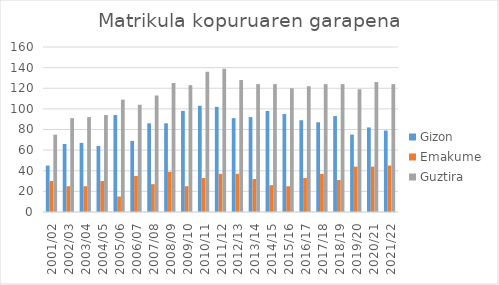
| Category | Gizon | Emakume | Guztira |
|---|---|---|---|
| 2001/02 | 45 | 30 | 75 |
| 2002/03 | 66 | 25 | 91 |
| 2003/04 | 67 | 25 | 92 |
| 2004/05 | 64 | 30 | 94 |
| 2005/06 | 94 | 15 | 109 |
| 2006/07 | 69 | 35 | 104 |
| 2007/08 | 86 | 27 | 113 |
| 2008/09 | 86 | 39 | 125 |
| 2009/10 | 98 | 25 | 123 |
| 2010/11 | 103 | 33 | 136 |
| 2011/12 | 102 | 37 | 139 |
| 2012/13 | 91 | 37 | 128 |
| 2013/14 | 92 | 32 | 124 |
| 2014/15 | 98 | 26 | 124 |
| 2015/16 | 95 | 25 | 120 |
| 2016/17 | 89 | 33 | 122 |
| 2017/18 | 87 | 37 | 124 |
| 2018/19 | 93 | 31 | 124 |
| 2019/20 | 75 | 44 | 119 |
| 2020/21 | 82 | 44 | 126 |
| 2021/22 | 79 | 45 | 124 |